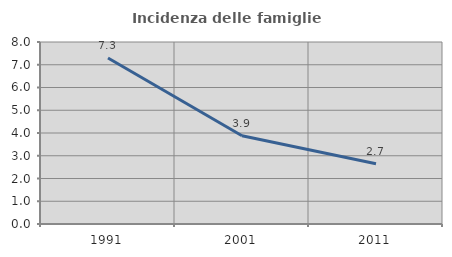
| Category | Incidenza delle famiglie numerose |
|---|---|
| 1991.0 | 7.293 |
| 2001.0 | 3.882 |
| 2011.0 | 2.651 |